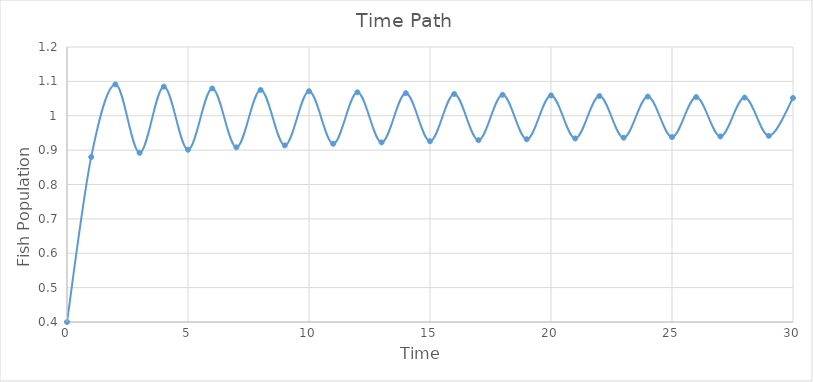
| Category | xt |
|---|---|
| 0.0 | 0.4 |
| 1.0 | 0.88 |
| 2.0 | 1.091 |
| 3.0 | 0.892 |
| 4.0 | 1.085 |
| 5.0 | 0.901 |
| 6.0 | 1.079 |
| 7.0 | 0.908 |
| 8.0 | 1.075 |
| 9.0 | 0.914 |
| 10.0 | 1.071 |
| 11.0 | 0.918 |
| 12.0 | 1.068 |
| 13.0 | 0.922 |
| 14.0 | 1.066 |
| 15.0 | 0.926 |
| 16.0 | 1.063 |
| 17.0 | 0.929 |
| 18.0 | 1.061 |
| 19.0 | 0.932 |
| 20.0 | 1.059 |
| 21.0 | 0.934 |
| 22.0 | 1.057 |
| 23.0 | 0.936 |
| 24.0 | 1.056 |
| 25.0 | 0.938 |
| 26.0 | 1.054 |
| 27.0 | 0.94 |
| 28.0 | 1.053 |
| 29.0 | 0.941 |
| 30.0 | 1.052 |